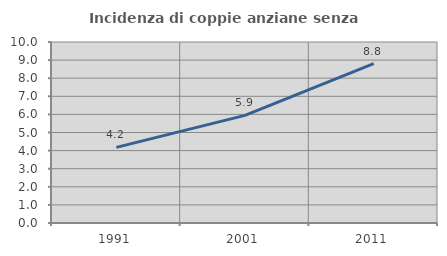
| Category | Incidenza di coppie anziane senza figli  |
|---|---|
| 1991.0 | 4.179 |
| 2001.0 | 5.946 |
| 2011.0 | 8.806 |